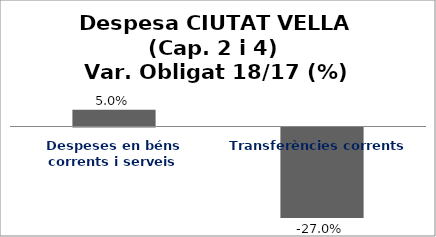
| Category | Series 0 |
|---|---|
| Despeses en béns corrents i serveis | 0.05 |
| Transferències corrents | -0.27 |